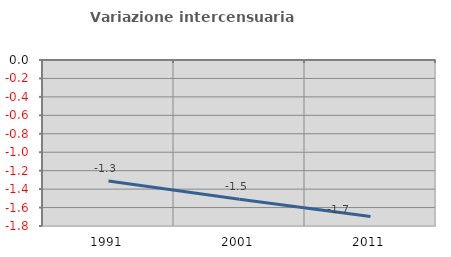
| Category | Variazione intercensuaria annua |
|---|---|
| 1991.0 | -1.312 |
| 2001.0 | -1.51 |
| 2011.0 | -1.697 |